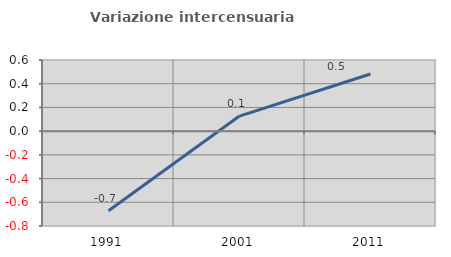
| Category | Variazione intercensuaria annua |
|---|---|
| 1991.0 | -0.672 |
| 2001.0 | 0.127 |
| 2011.0 | 0.482 |